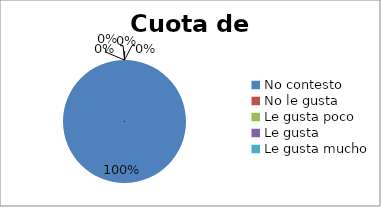
| Category | Series 0 |
|---|---|
| No contesto | 5 |
| No le gusta | 0 |
| Le gusta poco | 0 |
| Le gusta | 0 |
| Le gusta mucho | 0 |